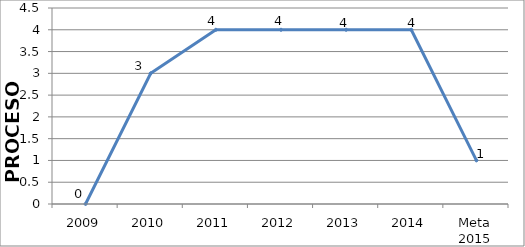
| Category | PROCESO |
|---|---|
| 2009 | 0 |
| 2010 | 3 |
| 2011 | 4 |
| 2012 | 4 |
| 2013 | 4 |
| 2014 | 4 |
| Meta 2015 | 1 |